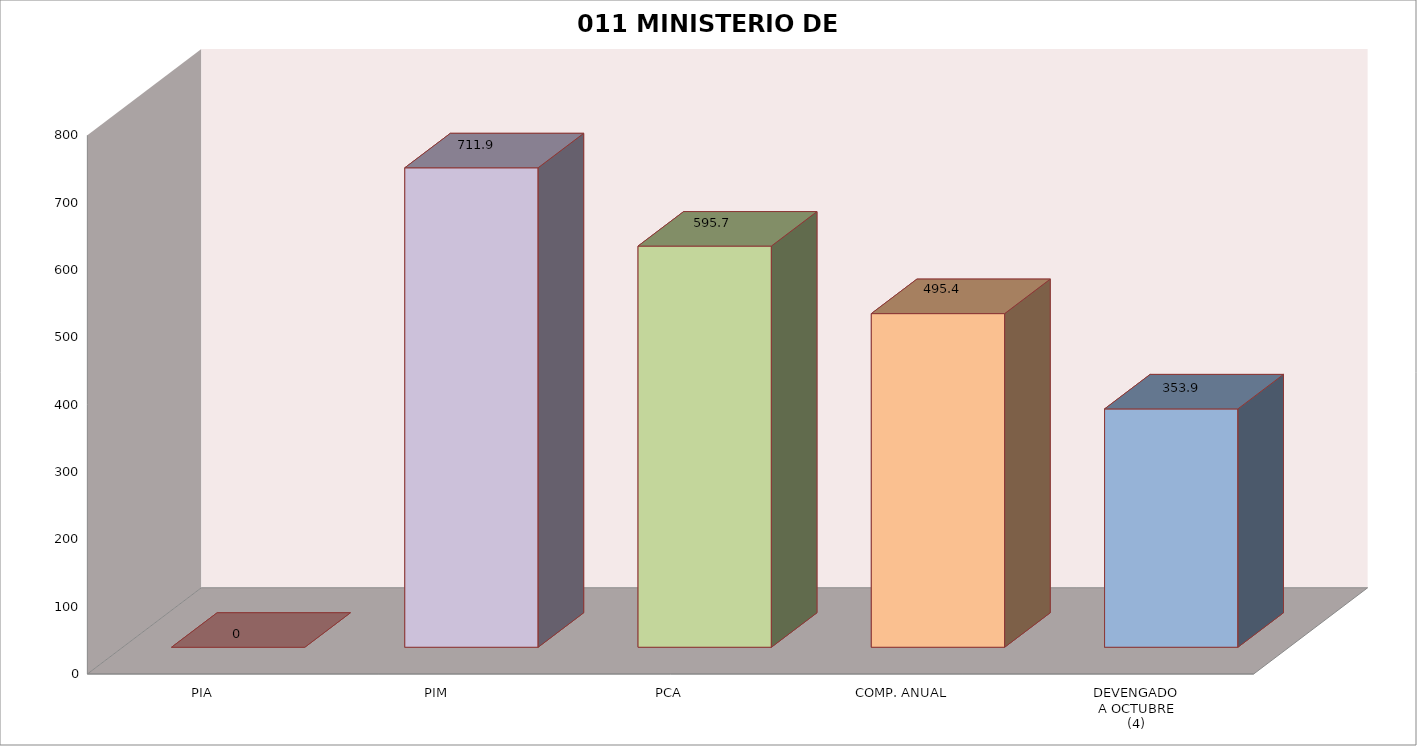
| Category | 011 MINISTERIO DE SALUD |
|---|---|
| PIA | 0 |
| PIM | 711.943 |
| PCA | 595.715 |
| COMP. ANUAL | 495.445 |
| DEVENGADO
A OCTUBRE
(4) | 353.9 |